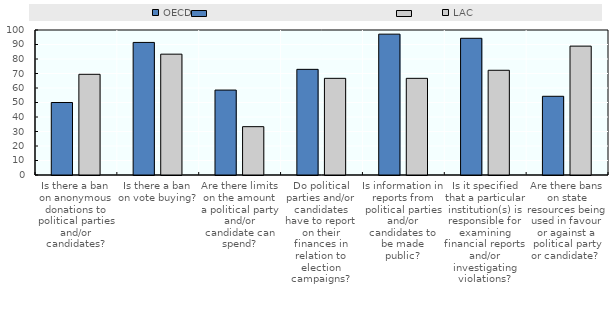
| Category | OECD | LAC |
|---|---|---|
| Is there a ban on anonymous donations to political parties and/or candidates? | 50 | 69.444 |
| Is there a ban on vote buying? | 91.429 | 83.333 |
| Are there limits on the amount a political party and/or candidate can spend? | 58.571 | 33.333 |
| Do political parties and/or candidates have to report on their finances in relation to election campaigns? | 72.857 | 66.667 |
| Is information in reports from political parties and/or candidates to be made public? | 97.143 | 66.667 |
| Is it specified that a particular institution(s) is responsible for examining financial reports and/or investigating violations? | 94.286 | 72.222 |
| Are there bans on state resources being used in favour or against a political party or candidate?  | 54.286 | 88.889 |